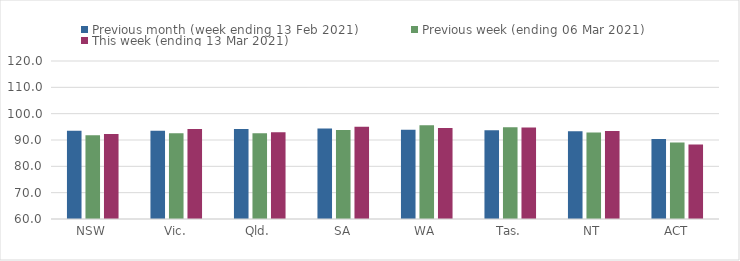
| Category | Previous month (week ending 13 Feb 2021) | Previous week (ending 06 Mar 2021) | This week (ending 13 Mar 2021) |
|---|---|---|---|
| NSW | 93.49 | 91.85 | 92.29 |
| Vic. | 93.56 | 92.61 | 94.2 |
| Qld. | 94.2 | 92.58 | 92.95 |
| SA | 94.36 | 93.79 | 95.01 |
| WA | 93.87 | 95.58 | 94.58 |
| Tas. | 93.75 | 94.82 | 94.76 |
| NT | 93.36 | 92.83 | 93.44 |
| ACT | 90.38 | 89.06 | 88.33 |